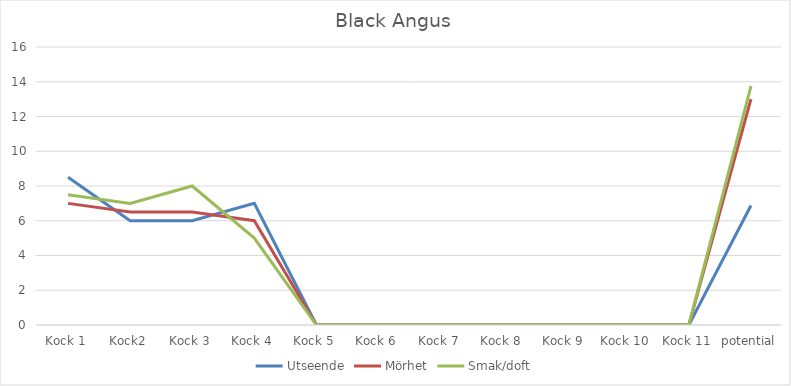
| Category | Utseende | Mörhet | Smak/doft |
|---|---|---|---|
| Kock 1 | 8.5 | 7 | 7.5 |
| Kock2 | 6 | 6.5 | 7 |
| Kock 3 | 6 | 6.5 | 8 |
| Kock 4 | 7 | 6 | 5 |
| Kock 5 | 0 | 0 | 0 |
| Kock 6 | 0 | 0 | 0 |
| Kock 7 | 0 | 0 | 0 |
| Kock 8 | 0 | 0 | 0 |
| Kock 9 | 0 | 0 | 0 |
| Kock 10 | 0 | 0 | 0 |
| Kock 11 | 0 | 0 | 0 |
| potential | 6.875 | 13 | 13.75 |